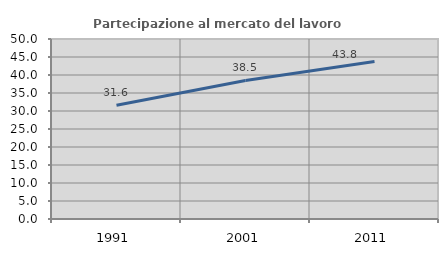
| Category | Partecipazione al mercato del lavoro  femminile |
|---|---|
| 1991.0 | 31.611 |
| 2001.0 | 38.482 |
| 2011.0 | 43.75 |